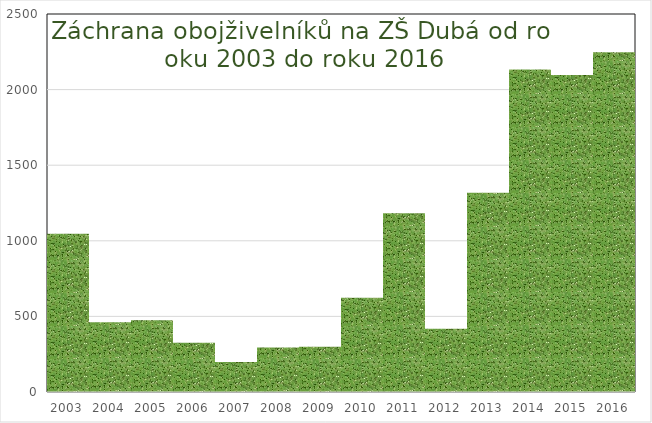
| Category | počet |
|---|---|
| 2003.0 | 1046 |
| 2004.0 | 462 |
| 2005.0 | 475 |
| 2006.0 | 325 |
| 2007.0 | 199 |
| 2008.0 | 295 |
| 2009.0 | 299 |
| 2010.0 | 624 |
| 2011.0 | 1183 |
| 2012.0 | 419 |
| 2013.0 | 1318 |
| 2014.0 | 2133 |
| 2015.0 | 2096 |
| 2016.0 | 2247 |